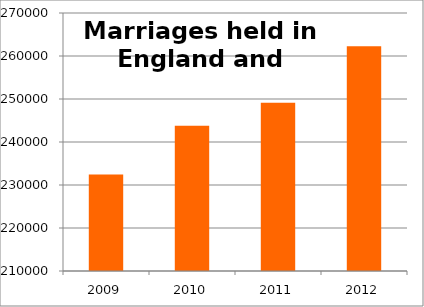
| Category | Series 0 |
|---|---|
| 2009.0 | 232443 |
| 2010.0 | 243808 |
| 2011.0 | 249133 |
| 2012.0 | 262240 |